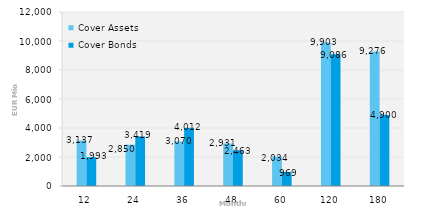
| Category | Cover Assets | Cover Bonds |
|---|---|---|
| 12.0 | 3136.6 | 1992.7 |
| 24.0 | 2849.7 | 3418.8 |
| 36.0 | 3069.8 | 4011.5 |
| 48.0 | 2931 | 2463.1 |
| 60.0 | 2034.3 | 969.2 |
| 120.0 | 9902.6 | 9085.7 |
| 180.0 | 9275.9 | 4900.3 |